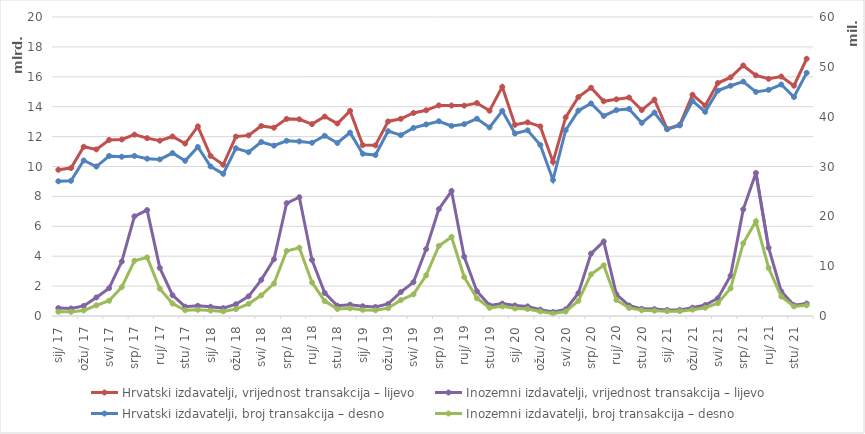
| Category | Hrvatski izdavatelji, vrijednost transakcija – lijevo | Inozemni izdavatelji, vrijednost transakcija – lijevo |
|---|---|---|
| 2017-01-01 | 9781216393 | 529330668 |
| 2017-02-01 | 9895011020 | 503480826 |
| 2017-03-01 | 11319301571 | 675467602 |
| 2017-04-01 | 11145176506 | 1243470970 |
| 2017-05-01 | 11773923776 | 1858098682 |
| 2017-06-01 | 11805960086 | 3640275087 |
| 2017-07-01 | 12131026231 | 6666766323 |
| 2017-08-01 | 11896320391 | 7086538105 |
| 2017-09-01 | 11728853022 | 3215744763 |
| 2017-10-01 | 12009171220 | 1390350453 |
| 2017-11-01 | 11534666862 | 620958222 |
| 2017-12-01 | 12684067350 | 681553609 |
| 2018-01-01 | 10709711514 | 618243765 |
| 2018-02-01 | 10117059082 | 528007961 |
| 2018-03-01 | 12000973469 | 787148459 |
| 2018-04-01 | 12081590304 | 1313997401 |
| 2018-05-01 | 12713805892 | 2414981001 |
| 2018-06-01 | 12594666713 | 3797479716 |
| 2018-07-01 | 13185004027 | 7546528379 |
| 2018-08-01 | 13157775731 | 7945964838 |
| 2018-09-01 | 12836023765 | 3750047605 |
| 2018-10-01 | 13341712666 | 1546133091 |
| 2018-11-01 | 12874154228 | 688682409 |
| 2018-12-01 | 13720353038 | 756236735 |
| 2019-01-01 | 11430961856 | 651874544 |
| 2019-02-01 | 11414718977 | 601782396 |
| 2019-03-01 | 13014399161 | 805219170 |
| 2019-04-01 | 13191260421 | 1598408777 |
| 2019-05-01 | 13580364900 | 2261956817 |
| 2019-06-01 | 13761363081 | 4476990759 |
| 2019-07-01 | 14088269414 | 7149142603 |
| 2019-08-01 | 14078608908 | 8359730082 |
| 2019-09-01 | 14072427523 | 3961960473 |
| 2019-10-01 | 14247219239 | 1659254244 |
| 2019-11-01 | 13732018595 | 710916631 |
| 2019-12-01 | 15325515357 | 828086145 |
| 2020-01-01 | 12787968816 | 701885312 |
| 2020-02-01 | 12952745874 | 640393636 |
| 2020-03-01 | 12683902324 | 422510481 |
| 2020-04-01 | 10305407524 | 264509749 |
| 2020-05-01 | 13287223415 | 444303649 |
| 2020-06-01 | 14645164496 | 1525289649 |
| 2020-07-01 | 15267977450 | 4173388524 |
| 2020-08-01 | 14362397361 | 4985377427 |
| 2020-09-01 | 14494659494 | 1454718337 |
| 2020-10-01 | 14614059699 | 700485949 |
| 2020-11-01 | 13777009716 | 477615413 |
| 2020-12-01 | 14475413547 | 459983904 |
| 2021-01-01 | 12509036964 | 401793949 |
| 2021-02-01 | 12798571789 | 405540867 |
| 2021-03-01 | 14801340215 | 555937729 |
| 2021-04-01 | 14070307259 | 731304887 |
| 2021-05-01 | 15585076683 | 1186789534 |
| 2021-06-01 | 15959926055 | 2697643850 |
| 2021-07-01 | 16756382366 | 7132385021 |
| 2021-08-01 | 16094111918 | 9566637938 |
| 2021-09-01 | 15864844532 | 4565452465 |
| 2021-10-01 | 16017242687 | 1646228061 |
| 2021-11-01 | 15404717357 | 723109373 |
| 2021-12-01 | 17207883171 | 831959711 |